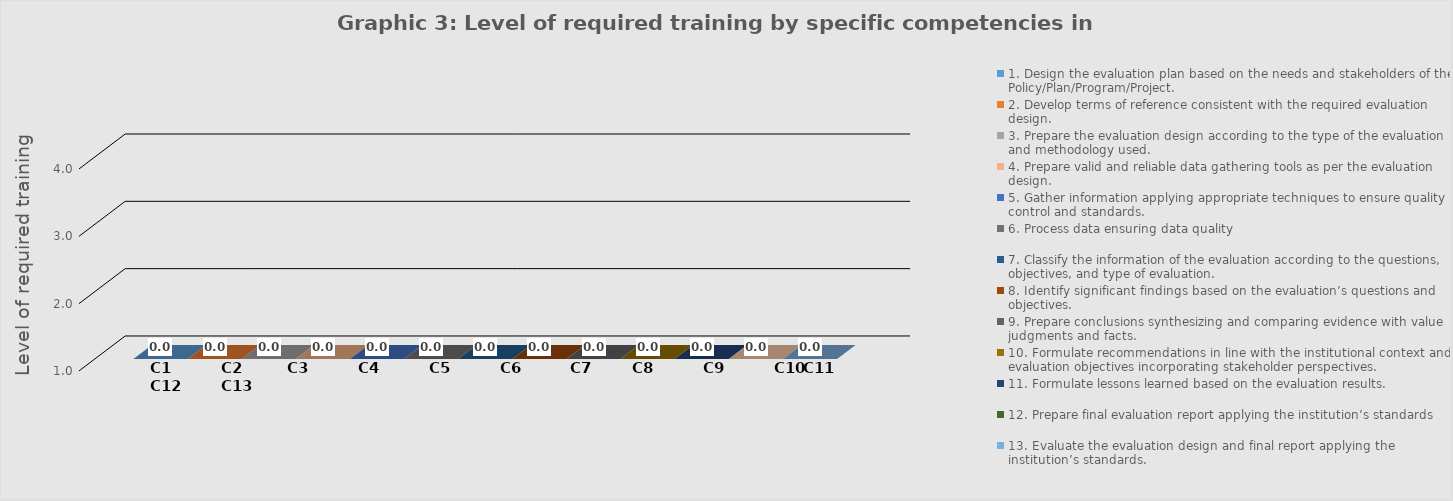
| Category | 1. Design the evaluation plan based on the needs and stakeholders of the Policy/Plan/Program/Project. | 2. Develop terms of reference consistent with the required evaluation design. | 3. Prepare the evaluation design according to the type of the evaluation and methodology used. | 4. Prepare valid and reliable data gathering tools as per the evaluation design. | 5. Gather information applying appropriate techniques to ensure quality control and standards. | 6. Process data ensuring data quality | 7. Classify the information of the evaluation according to the questions, objectives, and type of evaluation. | 8. Identify significant findings based on the evaluation’s questions and objectives. | 9. Prepare conclusions synthesizing and comparing evidence with value judgments and facts. | 10. Formulate recommendations in line with the institutional context and evaluation objectives incorporating stakeholder perspectives. | 11. Formulate lessons learned based on the evaluation results. | 12. Prepare final evaluation report applying the institution’s standards | 13. Evaluate the evaluation design and final report applying the institution’s standards. |
|---|---|---|---|---|---|---|---|---|---|---|---|---|---|
| 0 | 0 | 0 | 0 | 0 | 0 | 0 | 0 | 0 | 0 | 0 | 0 | 0 | 0 |